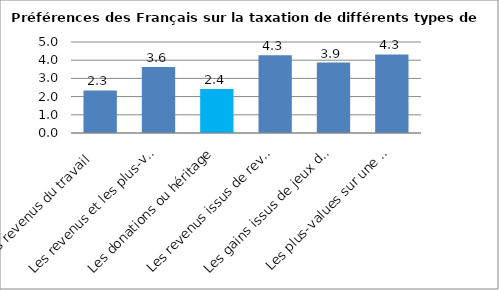
| Category | Series 0 |
|---|---|
| Les revenus du travail  | 2.34 |
| Les revenus et les plus-values issus de l’immobilier | 3.63 |
| Les donations ou héritage | 2.42 |
| Les revenus issus de revenus de placements financiers | 4.27 |
| Les gains issus de jeux de hasard | 3.87 |
| Les plus-values sur une entreprise créée et revendue | 4.32 |